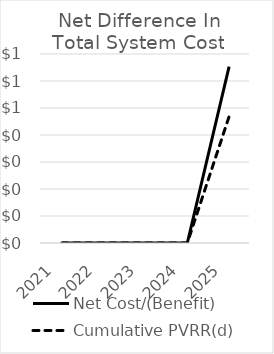
| Category | Net Cost/(Benefit) | Cumulative PVRR(d) |
|---|---|---|
| 2021.0 | 0 | 0 |
| 2022.0 | 0 | 0 |
| 2023.0 | 0 | 0 |
| 2024.0 | 0 | 0 |
| 2025.0 | 0.653 | 0.468 |